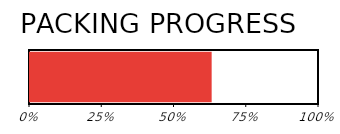
| Category | Packing Progress |
|---|---|
| Packed | 0.629 |